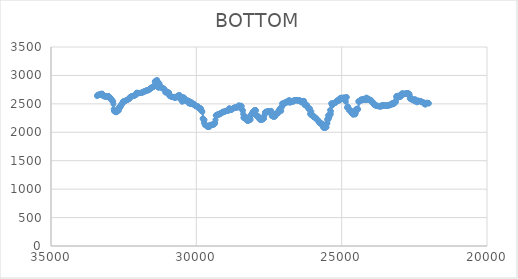
| Category | BOTTOM |
|---|---|
| 22002.2299 | 2505.87 |
| 22009.3637 | 2514.23 |
| 22019.6031 | 2514.32 |
| 22029.8431 | 2514.32 |
| 22040.0832 | 2518.51 |
| 22050.3232 | 2518.54 |
| 22060.5632 | 2512.96 |
| 22070.8032 | 2514.31 |
| 22081.0432 | 2508.74 |
| 22091.2833 | 2517.06 |
| 22101.5233 | 2518.53 |
| 22111.7633 | 2510.17 |
| 22122.0033 | 2484.98 |
| 22132.2433 | 2509.88 |
| 22142.4834 | 2507.31 |
| 22152.7234 | 2505.89 |
| 22162.9634 | 2507.27 |
| 22173.2034 | 2503.09 |
| 22183.4434 | 2523.99 |
| 22193.6835 | 2525.57 |
| 22203.9235 | 2525.58 |
| 22214.1635 | 2526.98 |
| 22224.4035 | 2531.18 |
| 22234.6435 | 2534 |
| 22244.8836 | 2532.63 |
| 22255.1236 | 2532.62 |
| 22265.3636 | 2531.22 |
| 22275.6036 | 2549.36 |
| 22285.8436 | 2549.51 |
| 22296.0837 | 2549.51 |
| 22306.3237 | 2549.51 |
| 22316.5637 | 2550.91 |
| 22326.8037 | 2550.92 |
| 22337.0437 | 2552.31 |
| 22347.2838 | 2552.32 |
| 22357.5238 | 2542.55 |
| 22367.7638 | 2553.65 |
| 22378.0038 | 2542.56 |
| 22388.2438 | 2559.23 |
| 22398.4839 | 2549.58 |
| 22408.7239 | 2525.76 |
| 22418.9639 | 2553.52 |
| 22429.2039 | 2553.73 |
| 22439.4439 | 2548.14 |
| 22449.684 | 2542.51 |
| 22459.924 | 2576 |
| 22470.164 | 2576.25 |
| 22480.404 | 2576.25 |
| 22490.6441 | 2567.87 |
| 22500.8841 | 2545.45 |
| 22511.1241 | 2573.24 |
| 22521.3641 | 2565.05 |
| 22531.6041 | 2574.78 |
| 22541.8442 | 2574.85 |
| 22552.0842 | 2567.86 |
| 22562.3242 | 2576.19 |
| 22572.5642 | 2573.46 |
| 22582.8042 | 2576.23 |
| 22593.0443 | 2576.25 |
| 22603.2843 | 2584.64 |
| 22613.5243 | 2608.46 |
| 22623.7643 | 2589.06 |
| 22634.0043 | 2590.32 |
| 22644.2444 | 2597.32 |
| 22654.4844 | 2591.78 |
| 22664.7244 | 2667.24 |
| 22674.9644 | 2664.95 |
| 22685.2044 | 2678.92 |
| 22695.4445 | 2679.01 |
| 22705.6845 | 2680.41 |
| 22715.9245 | 2684.61 |
| 22726.1645 | 2681.84 |
| 22736.4045 | 2683.22 |
| 22746.6446 | 2684.63 |
| 22756.8846 | 2684.64 |
| 22767.1246 | 2688.84 |
| 22777.3646 | 2688.86 |
| 22787.6046 | 2676.27 |
| 22797.8447 | 2674.8 |
| 22808.0847 | 2674.79 |
| 22818.3247 | 2674.79 |
| 22828.5647 | 2673.39 |
| 22838.8047 | 2677.58 |
| 22849.0448 | 2677.6 |
| 22859.2848 | 2677.6 |
| 22869.5248 | 2666.41 |
| 22879.7648 | 2677.54 |
| 22890.0049 | 2676.2 |
| 22900.2449 | 2685.99 |
| 22910.4849 | 2667.86 |
| 22920.7249 | 2678.95 |
| 22930.9649 | 2662.22 |
| 22941.205 | 2680.31 |
| 22951.445 | 2655.22 |
| 22961.685 | 2631.29 |
| 22971.925 | 2628.35 |
| 22982.165 | 2631.14 |
| 22992.4051 | 2622.75 |
| 23002.6451 | 2626.91 |
| 23012.8851 | 2624.13 |
| 23023.1251 | 2625.51 |
| 23033.3651 | 2624.12 |
| 23043.6052 | 2624.11 |
| 23053.8452 | 2643.72 |
| 23064.0852 | 2606.01 |
| 23074.3252 | 2633.82 |
| 23084.5652 | 2629.77 |
| 23094.8053 | 2633.94 |
| 23105.0453 | 2633.97 |
| 23115.2853 | 2636.77 |
| 23125.5253 | 2618.57 |
| 23135.7653 | 2535.85 |
| 23146.0054 | 2527.03 |
| 23156.2454 | 2525.59 |
| 23166.4854 | 2525.58 |
| 23176.7254 | 2511.57 |
| 23186.9654 | 2533.92 |
| 23197.2055 | 2513.01 |
| 23207.4455 | 2498.9 |
| 23217.6855 | 2494.63 |
| 23227.9255 | 2508.62 |
| 23238.1656 | 2494.68 |
| 23248.4056 | 2496.01 |
| 23258.6456 | 2511.43 |
| 23268.8856 | 2508.7 |
| 23279.1256 | 2501.68 |
| 23289.3657 | 2490.44 |
| 23299.6057 | 2483.38 |
| 23309.8457 | 2483.35 |
| 23320.0857 | 2484.75 |
| 23330.3257 | 2476.35 |
| 23340.5658 | 2481.92 |
| 23350.8058 | 2486.15 |
| 23361.0458 | 2483.36 |
| 23371.2858 | 2473.54 |
| 23381.5258 | 2470.69 |
| 23391.7659 | 2473.49 |
| 23402.0059 | 2470.69 |
| 23412.2459 | 2470.68 |
| 23422.4859 | 2470.68 |
| 23432.7259 | 2463.67 |
| 23442.966 | 2473.46 |
| 23453.206 | 2473.5 |
| 23463.446 | 2470.69 |
| 23473.686 | 2467.88 |
| 23483.926 | 2467.87 |
| 23494.1661 | 2469.27 |
| 23504.4061 | 2469.28 |
| 23514.6461 | 2469.28 |
| 23524.8861 | 2466.47 |
| 23535.1261 | 2470.67 |
| 23545.3662 | 2470.68 |
| 23555.6062 | 2470.68 |
| 23565.8462 | 2470.68 |
| 23576.0862 | 2470.68 |
| 23586.3262 | 2472.09 |
| 23596.5663 | 2480.51 |
| 23606.8063 | 2472.12 |
| 23617.0463 | 2469.28 |
| 23627.2863 | 2469.28 |
| 23637.5264 | 2452.44 |
| 23647.7664 | 2466.42 |
| 23658.0064 | 2463.65 |
| 23668.2464 | 2452.42 |
| 23678.4864 | 2463.61 |
| 23688.7265 | 2448.21 |
| 23698.9665 | 2459.39 |
| 23709.2065 | 2460.83 |
| 23719.4465 | 2463.64 |
| 23729.6865 | 2463.64 |
| 23739.9266 | 2463.64 |
| 23750.1666 | 2460.84 |
| 23760.4066 | 2463.64 |
| 23770.6466 | 2458.03 |
| 23780.8866 | 2465.03 |
| 23791.1267 | 2463.65 |
| 23801.3667 | 2472.07 |
| 23811.6067 | 2467.88 |
| 23821.8467 | 2467.87 |
| 23832.0867 | 2470.68 |
| 23842.3268 | 2487.53 |
| 23852.5668 | 2476.34 |
| 23862.8068 | 2480.53 |
| 23873.0468 | 2480.54 |
| 23883.2868 | 2481.94 |
| 23893.5269 | 2497.39 |
| 23903.7669 | 2497.43 |
| 23914.0069 | 2525.52 |
| 23924.2469 | 2525.58 |
| 23934.4869 | 2524.18 |
| 23944.727 | 2524.17 |
| 23954.967 | 2525.58 |
| 23965.207 | 2535.41 |
| 23975.447 | 2546.67 |
| 23985.6871 | 2560.74 |
| 23995.9271 | 2567.79 |
| 24006.1671 | 2562.19 |
| 24016.4071 | 2563.58 |
| 24026.6471 | 2564.99 |
| 24036.8872 | 2577.64 |
| 24047.1272 | 2569.23 |
| 24057.3672 | 2569.22 |
| 24067.6072 | 2573.43 |
| 24077.8472 | 2583.28 |
| 24088.0873 | 2583.29 |
| 24098.3273 | 2577.67 |
| 24108.5673 | 2579.07 |
| 24118.8073 | 2590.31 |
| 24129.0473 | 2602.98 |
| 24139.2874 | 2605.81 |
| 24149.5274 | 2608.63 |
| 24159.7674 | 2569.27 |
| 24170.0074 | 2566.4 |
| 24180.2474 | 2570.62 |
| 24190.4875 | 2570.62 |
| 24200.7275 | 2567.81 |
| 24210.9675 | 2574.84 |
| 24221.2075 | 2590.31 |
| 24231.4475 | 2573.46 |
| 24241.6876 | 2580.47 |
| 24251.9276 | 2576.26 |
| 24262.1676 | 2573.44 |
| 24272.4076 | 2586.1 |
| 24282.6476 | 2570.64 |
| 24292.8877 | 2576.25 |
| 24303.1277 | 2559.38 |
| 24313.3677 | 2569.21 |
| 24323.6077 | 2569.22 |
| 24333.8478 | 2579.06 |
| 24344.0878 | 2562.19 |
| 24354.3278 | 2556.55 |
| 24364.5678 | 2563.58 |
| 24374.8078 | 2553.74 |
| 24385.0479 | 2543.88 |
| 24395.2879 | 2545.29 |
| 24405.5279 | 2532.62 |
| 24415.7679 | 2543.87 |
| 24426.0079 | 2543.88 |
| 24436.248 | 2401.76 |
| 24446.488 | 2410.15 |
| 24456.728 | 2417.19 |
| 24466.968 | 2407.34 |
| 24477.208 | 2407.34 |
| 24487.4481 | 2403.12 |
| 24497.6881 | 2403.12 |
| 24507.9281 | 2348.23 |
| 24518.1681 | 2400.3 |
| 24528.4081 | 2317.25 |
| 24538.6482 | 2314.44 |
| 24548.8882 | 2324.29 |
| 24559.1282 | 2324.29 |
| 24569.3682 | 2328.51 |
| 24579.6082 | 2336.96 |
| 24589.8483 | 2328.51 |
| 24600.0883 | 2313.03 |
| 24610.3283 | 2313.03 |
| 24620.5683 | 2315.85 |
| 24630.8084 | 2334.15 |
| 24641.0484 | 2336.96 |
| 24651.2884 | 2339.78 |
| 24661.5284 | 2342.6 |
| 24671.7684 | 2370.73 |
| 24682.0085 | 2355.27 |
| 24692.2485 | 2379.19 |
| 24702.4885 | 2374.98 |
| 24712.7285 | 2393.26 |
| 24722.9685 | 2394.67 |
| 24733.2086 | 2389.04 |
| 24743.4486 | 2389.05 |
| 24753.6886 | 2396.09 |
| 24763.9286 | 2407.37 |
| 24774.1686 | 2446.74 |
| 24784.4087 | 2435.51 |
| 24794.6487 | 2455.18 |
| 24804.8887 | 2431.27 |
| 24815.1287 | 2435.68 |
| 24825.3687 | 2618.48 |
| 24835.6088 | 2612.85 |
| 24845.8488 | 2612.77 |
| 24856.0888 | 2538.33 |
| 24866.3288 | 2607.16 |
| 24876.5688 | 2556.61 |
| 24886.8089 | 2607.22 |
| 24897.0489 | 2607.22 |
| 24907.2889 | 2607.22 |
| 24917.5289 | 2607.22 |
| 24927.769 | 2607.22 |
| 24938.009 | 2607.22 |
| 24948.249 | 2605.78 |
| 24958.489 | 2583.32 |
| 24968.729 | 2604.41 |
| 24978.9691 | 2605.81 |
| 24989.2091 | 2600.18 |
| 24999.4491 | 2600.19 |
| 25009.6891 | 2605.82 |
| 25019.9291 | 2607.21 |
| 25030.1692 | 2602.95 |
| 25040.4092 | 2574.9 |
| 25050.6492 | 2602.95 |
| 25060.8892 | 2579.08 |
| 25071.1292 | 2586.1 |
| 25081.3693 | 2580.42 |
| 25091.6093 | 2552.37 |
| 25101.8493 | 2574.85 |
| 25112.0893 | 2574.81 |
| 25122.3293 | 2559.36 |
| 25132.5694 | 2559.36 |
| 25142.8094 | 2557.95 |
| 25153.0494 | 2555.13 |
| 25163.2894 | 2552.32 |
| 25173.5294 | 2552.29 |
| 25183.7695 | 2535.45 |
| 25194.0095 | 2541.03 |
| 25204.2495 | 2525.57 |
| 25214.4895 | 2522.75 |
| 25224.7296 | 2515.73 |
| 25234.9696 | 2515.72 |
| 25245.2096 | 2512.9 |
| 25255.4496 | 2510.09 |
| 25265.6896 | 2508.68 |
| 25275.9297 | 2507.28 |
| 25286.1697 | 2507.28 |
| 25296.4097 | 2508.68 |
| 25306.6497 | 2504.45 |
| 25316.8897 | 2500.16 |
| 25327.1298 | 2472.17 |
| 25337.3698 | 2501.67 |
| 25347.6098 | 2507.28 |
| 25357.8498 | 2505.47 |
| 25368.0898 | 2370.59 |
| 25378.3299 | 2318.65 |
| 25388.5699 | 2316.07 |
| 25398.8099 | 2390.26 |
| 25409.0499 | 2328.36 |
| 25419.2899 | 2280.62 |
| 25429.53 | 2270.77 |
| 25439.77 | 2260.86 |
| 25450.01 | 2234.17 |
| 25460.25 | 2224.59 |
| 25470.49 | 2295.9 |
| 25480.7301 | 2225.52 |
| 25490.9701 | 2157.02 |
| 25501.2101 | 2225.52 |
| 25511.4501 | 2156.55 |
| 25521.6902 | 2090.61 |
| 25531.9302 | 2086.4 |
| 25542.1702 | 2086.4 |
| 25552.4102 | 2086.38 |
| 25562.6502 | 2079.57 |
| 25572.8903 | 2134.06 |
| 25583.1303 | 2079.37 |
| 25593.3703 | 2079.37 |
| 25603.6103 | 2080.77 |
| 25613.8503 | 2080.79 |
| 25624.0904 | 2085 |
| 25634.3304 | 2086.48 |
| 25644.5704 | 2104.78 |
| 25654.8104 | 2122.97 |
| 25665.0504 | 2114.72 |
| 25675.2905 | 2155.34 |
| 25685.5305 | 2146.88 |
| 25695.7705 | 2134.34 |
| 25706.0105 | 2152.6 |
| 25716.2505 | 2161 |
| 25726.4906 | 2159.61 |
| 25736.7306 | 2161.06 |
| 25746.9706 | 2172.22 |
| 25757.2106 | 2161.03 |
| 25767.4506 | 2165.27 |
| 25777.6907 | 2173.79 |
| 25787.9307 | 2199.04 |
| 25798.1707 | 2204.62 |
| 25808.4107 | 2199.07 |
| 25818.6508 | 2211.68 |
| 25828.8908 | 2211.76 |
| 25839.1308 | 2228.55 |
| 25849.3708 | 2224.35 |
| 25859.6108 | 2224.39 |
| 25869.8509 | 2232.86 |
| 25880.0909 | 2246.89 |
| 25890.3309 | 2249.73 |
| 25900.5709 | 2258.15 |
| 25910.8109 | 2262.36 |
| 25921.051 | 2262.36 |
| 25931.291 | 2262.37 |
| 25941.531 | 2265.16 |
| 25951.771 | 2263.86 |
| 25962.011 | 2283.4 |
| 25972.2511 | 2268.11 |
| 25982.4911 | 2294.76 |
| 25992.7311 | 2300.35 |
| 26002.9711 | 2297.57 |
| 26013.2111 | 2303.14 |
| 26023.4512 | 2296.17 |
| 26033.6912 | 2303.49 |
| 26043.9312 | 2367.64 |
| 26054.1712 | 2310.21 |
| 26064.4113 | 2310.24 |
| 26074.6513 | 2315.92 |
| 26084.8913 | 2330.36 |
| 26095.1313 | 2418.59 |
| 26105.3713 | 2415.79 |
| 26115.6114 | 2415.73 |
| 26125.8514 | 2404.6 |
| 26136.0914 | 2420 |
| 26146.3314 | 2418.7 |
| 26156.5714 | 2438.31 |
| 26166.8115 | 2438.38 |
| 26177.0515 | 2452.35 |
| 26187.2915 | 2445.54 |
| 26197.5315 | 2483.33 |
| 26207.7715 | 2479.13 |
| 26218.0116 | 2479.11 |
| 26228.2516 | 2476.34 |
| 26238.4916 | 2481.93 |
| 26248.7316 | 2479.14 |
| 26258.9716 | 2480.52 |
| 26269.2117 | 2477.82 |
| 26279.4517 | 2496.3 |
| 26289.6917 | 2548.09 |
| 26299.9317 | 2546.72 |
| 26310.1717 | 2550.92 |
| 26320.4118 | 2552.29 |
| 26330.6518 | 2546.72 |
| 26340.8918 | 2550.92 |
| 26351.1318 | 2550.91 |
| 26361.3719 | 2549.51 |
| 26371.6119 | 2549.37 |
| 26381.8519 | 2524.31 |
| 26392.0919 | 2549.51 |
| 26402.3319 | 2549.45 |
| 26412.572 | 2538.3 |
| 26422.812 | 2548.16 |
| 26433.052 | 2559.38 |
| 26443.292 | 2562.18 |
| 26453.532 | 2562.11 |
| 26463.7721 | 2550.96 |
| 26474.0121 | 2557.96 |
| 26484.2521 | 2559.35 |
| 26494.4921 | 2557.96 |
| 26504.7321 | 2557.96 |
| 26514.9722 | 2557.96 |
| 26525.2122 | 2557.97 |
| 26535.4522 | 2560.8 |
| 26545.6922 | 2566.41 |
| 26555.9322 | 2567.82 |
| 26566.1723 | 2569.22 |
| 26576.4123 | 2569.18 |
| 26586.6523 | 2563.59 |
| 26596.8923 | 2563.59 |
| 26607.1324 | 2563.59 |
| 26617.3724 | 2563.57 |
| 26627.6124 | 2560.77 |
| 26637.8524 | 2560.68 |
| 26648.0924 | 2545.27 |
| 26658.3325 | 2542.47 |
| 26668.5725 | 2542.47 |
| 26678.8125 | 2542.55 |
| 26689.0525 | 2555.08 |
| 26699.2925 | 2545.28 |
| 26709.5326 | 2543.89 |
| 26719.7726 | 2545.18 |
| 26730.0126 | 2528.49 |
| 26740.2526 | 2543.83 |
| 26750.4926 | 2535.42 |
| 26760.7327 | 2532.68 |
| 26770.9727 | 2542.35 |
| 26781.2127 | 2522.76 |
| 26791.4527 | 2523.02 |
| 26801.6927 | 2563.58 |
| 26811.9328 | 2562.16 |
| 26822.1728 | 2559.29 |
| 26832.4128 | 2548.09 |
| 26842.6528 | 2546.69 |
| 26852.8929 | 2545.27 |
| 26863.1329 | 2542.43 |
| 26873.3729 | 2535.37 |
| 26883.6129 | 2525.66 |
| 26893.8529 | 2538.15 |
| 26904.093 | 2522.76 |
| 26914.333 | 2522.76 |
| 26924.573 | 2522.76 |
| 26934.813 | 2522.76 |
| 26945.053 | 2522.78 |
| 26955.2931 | 2525.44 |
| 26965.5331 | 2504.45 |
| 26975.7731 | 2501.67 |
| 26986.0131 | 2504.45 |
| 26996.2531 | 2501.65 |
| 27006.4932 | 2501.65 |
| 27016.7332 | 2501.66 |
| 27026.9732 | 2503.07 |
| 27037.2132 | 2504.48 |
| 27047.4532 | 2505.45 |
| 27057.6933 | 2442.53 |
| 27067.9333 | 2442.08 |
| 27078.1733 | 2375.35 |
| 27088.4133 | 2432.66 |
| 27098.6534 | 2429.83 |
| 27108.8934 | 2425.52 |
| 27119.1334 | 2407.26 |
| 27129.3734 | 2396.18 |
| 27139.6134 | 2409.97 |
| 27149.8535 | 2383.41 |
| 27160.0935 | 2383.39 |
| 27170.3335 | 2380.37 |
| 27180.5735 | 2348.13 |
| 27190.8135 | 2335.52 |
| 27201.0536 | 2331.36 |
| 27211.2936 | 2335.5 |
| 27221.5336 | 2328.51 |
| 27231.7736 | 2328.48 |
| 27242.0136 | 2324.32 |
| 27252.2537 | 2328.51 |
| 27262.4937 | 2328.52 |
| 27272.7337 | 2329.58 |
| 27282.9737 | 2282.06 |
| 27293.2137 | 2282.05 |
| 27303.4538 | 2280.62 |
| 27313.6938 | 2276.43 |
| 27323.9338 | 2276.45 |
| 27334.1738 | 2279.24 |
| 27344.4139 | 2277.81 |
| 27354.6539 | 2273.67 |
| 27364.8939 | 2280.71 |
| 27375.1339 | 2287.66 |
| 27385.3739 | 2283.59 |
| 27395.614 | 2300.26 |
| 27405.854 | 2286.51 |
| 27416.094 | 2317.69 |
| 27426.334 | 2376.36 |
| 27436.574 | 2374.93 |
| 27446.8141 | 2370.76 |
| 27457.0541 | 2373.53 |
| 27467.2941 | 2369.36 |
| 27477.5341 | 2372.13 |
| 27487.7741 | 2369.33 |
| 27498.0142 | 2369.33 |
| 27508.2542 | 2369.33 |
| 27518.4942 | 2369.33 |
| 27528.7342 | 2369.3 |
| 27538.9742 | 2365.11 |
| 27549.2143 | 2365.11 |
| 27559.4543 | 2365.05 |
| 27569.6943 | 2356.69 |
| 27579.9343 | 2359.53 |
| 27590.1744 | 2366.41 |
| 27600.4144 | 2352.44 |
| 27610.6544 | 2352.42 |
| 27620.8944 | 2349.63 |
| 27631.1344 | 2349.63 |
| 27641.3745 | 2349.29 |
| 27651.6145 | 2305.86 |
| 27661.8545 | 2288.73 |
| 27672.0945 | 2241.21 |
| 27682.3345 | 2237.01 |
| 27692.5746 | 2235.61 |
| 27702.8146 | 2235.55 |
| 27713.0546 | 2227.15 |
| 27723.2946 | 2225.75 |
| 27733.5346 | 2224.34 |
| 27743.7747 | 2222.93 |
| 27754.0147 | 2221.55 |
| 27764.2547 | 2222.94 |
| 27774.4947 | 2222.93 |
| 27784.7347 | 2221.55 |
| 27794.9748 | 2222.97 |
| 27805.2148 | 2225.76 |
| 27815.4548 | 2225.77 |
| 27825.6948 | 2227.45 |
| 27835.9349 | 2262.36 |
| 27846.1749 | 2262.36 |
| 27856.4149 | 2262.36 |
| 27866.6549 | 2262.54 |
| 27876.8949 | 2284.87 |
| 27887.135 | 2283.39 |
| 27897.375 | 2273.63 |
| 27907.615 | 2275.1 |
| 27917.855 | 2284.88 |
| 27928.095 | 2285.02 |
| 27938.3351 | 2302.41 |
| 27948.5751 | 2379.29 |
| 27958.8151 | 2391.86 |
| 27969.0551 | 2391.84 |
| 27979.2951 | 2390.43 |
| 27989.5352 | 2387.65 |
| 27999.7752 | 2388.87 |
| 28010.0152 | 2367.93 |
| 28020.2552 | 2367.84 |
| 28030.4953 | 2358.12 |
| 28040.7353 | 2363.69 |
| 28050.9753 | 2362.3 |
| 28061.2153 | 2361.93 |
| 28071.4553 | 2318.77 |
| 28081.6954 | 2331.33 |
| 28091.9354 | 2331.21 |
| 28102.1754 | 2317.11 |
| 28112.4154 | 2300.28 |
| 28122.6554 | 2289.95 |
| 28132.8955 | 2225.7 |
| 28143.1355 | 2219.32 |
| 28153.3755 | 2288.49 |
| 28163.6155 | 2218.72 |
| 28173.8555 | 2218.67 |
| 28184.0956 | 2213.05 |
| 28194.3356 | 2208.89 |
| 28204.5756 | 2211.6 |
| 28214.8156 | 2201.85 |
| 28225.0556 | 2204.67 |
| 28235.2957 | 2207.43 |
| 28245.5357 | 2204.66 |
| 28255.7757 | 2206.09 |
| 28266.0157 | 2210.66 |
| 28276.2558 | 2253.91 |
| 28286.4958 | 2253.93 |
| 28296.7358 | 2256.46 |
| 28306.9758 | 2227.49 |
| 28317.2158 | 2263.73 |
| 28327.4559 | 2259.75 |
| 28337.6959 | 2283.48 |
| 28347.9359 | 2284.74 |
| 28358.1759 | 2269.27 |
| 28368.4159 | 2255.32 |
| 28378.656 | 2255.9 |
| 28388.896 | 2320.59 |
| 28399.136 | 2377.91 |
| 28409.376 | 2391.87 |
| 28419.616 | 2393.29 |
| 28429.8561 | 2396.64 |
| 28440.0961 | 2458 |
| 28450.3361 | 2456.58 |
| 28460.5761 | 2453.93 |
| 28470.8161 | 2469.21 |
| 28481.0562 | 2462.22 |
| 28491.2962 | 2460.83 |
| 28501.5362 | 2460.83 |
| 28511.7762 | 2460.83 |
| 28522.0163 | 2460.91 |
| 28532.2563 | 2469.28 |
| 28542.4963 | 2469.28 |
| 28552.7363 | 2469.05 |
| 28562.9763 | 2445.29 |
| 28573.2164 | 2439.69 |
| 28583.4564 | 2436.93 |
| 28593.6964 | 2439.69 |
| 28603.9364 | 2436.89 |
| 28614.1764 | 2435.51 |
| 28624.4165 | 2436.9 |
| 28634.6565 | 2436.9 |
| 28644.8965 | 2436.86 |
| 28655.1365 | 2432.73 |
| 28665.3765 | 2438.24 |
| 28675.6166 | 2431.27 |
| 28685.8566 | 2431.32 |
| 28696.0966 | 2436.81 |
| 28706.3366 | 2427.01 |
| 28716.5767 | 2422.82 |
| 28726.8167 | 2422.74 |
| 28737.0567 | 2414.36 |
| 28747.2967 | 2412.97 |
| 28757.5367 | 2412.86 |
| 28767.7768 | 2401.72 |
| 28778.0168 | 2403.08 |
| 28788.2568 | 2398.88 |
| 28798.4968 | 2397.5 |
| 28808.7368 | 2398.94 |
| 28818.9769 | 2403.02 |
| 28829.2169 | 2393.26 |
| 28839.4569 | 2393.28 |
| 28849.6969 | 2394.96 |
| 28859.9369 | 2423.83 |
| 28870.177 | 2383.72 |
| 28880.417 | 2414.11 |
| 28890.657 | 2387.61 |
| 28900.897 | 2384.82 |
| 28911.1371 | 2384.82 |
| 28921.3771 | 2384.79 |
| 28931.6171 | 2381.93 |
| 28941.8571 | 2374.99 |
| 28952.0971 | 2377.78 |
| 28962.3372 | 2377.75 |
| 28972.5772 | 2374.97 |
| 28982.8172 | 2374.98 |
| 28993.0572 | 2376.32 |
| 29003.2972 | 2370.67 |
| 29013.5373 | 2363.69 |
| 29023.7773 | 2362.28 |
| 29034.0173 | 2360.87 |
| 29044.2573 | 2359.5 |
| 29054.4973 | 2360.87 |
| 29064.7374 | 2359.5 |
| 29074.9774 | 2360.87 |
| 29085.2174 | 2359.51 |
| 29095.4574 | 2362.11 |
| 29105.6974 | 2344 |
| 29115.9375 | 2344 |
| 29126.1775 | 2343.9 |
| 29136.4175 | 2334.13 |
| 29146.6575 | 2332.77 |
| 29156.8976 | 2335.49 |
| 29167.1376 | 2329.88 |
| 29177.3776 | 2325.79 |
| 29187.6176 | 2333.95 |
| 29197.8576 | 2315.85 |
| 29208.0977 | 2315.85 |
| 29218.3377 | 2315.82 |
| 29228.5777 | 2313.03 |
| 29238.8177 | 2313.03 |
| 29249.0577 | 2313.04 |
| 29259.2978 | 2314.45 |
| 29269.5378 | 2315.71 |
| 29279.7778 | 2303.19 |
| 29290.0178 | 2304.58 |
| 29300.2578 | 2304.57 |
| 29310.4979 | 2303.15 |
| 29320.7379 | 2300.32 |
| 29330.9779 | 2295.34 |
| 29341.2179 | 2220.92 |
| 29351.458 | 2163.81 |
| 29361.698 | 2162.29 |
| 29371.938 | 2151.12 |
| 29382.178 | 2148.22 |
| 29392.418 | 2137.06 |
| 29402.6581 | 2135.84 |
| 29412.8981 | 2150.99 |
| 29423.1381 | 2135.73 |
| 29433.3781 | 2141.19 |
| 29443.6181 | 2131.4 |
| 29453.8582 | 2127.22 |
| 29464.0982 | 2127.22 |
| 29474.3382 | 2127.22 |
| 29484.5782 | 2127.26 |
| 29494.8182 | 2130.04 |
| 29505.0583 | 2130.04 |
| 29515.2983 | 2130.04 |
| 29525.5383 | 2129.95 |
| 29535.7783 | 2121.36 |
| 29546.0184 | 2100.67 |
| 29556.2584 | 2117.09 |
| 29566.4984 | 2092.05 |
| 29576.7384 | 2093.49 |
| 29586.9784 | 2097.62 |
| 29597.2185 | 2093.52 |
| 29607.4585 | 2100.45 |
| 29617.6985 | 2097.87 |
| 29627.9385 | 2115.96 |
| 29638.1785 | 2115.9 |
| 29648.4186 | 2110.41 |
| 29658.6586 | 2117.37 |
| 29668.8986 | 2117.45 |
| 29679.1386 | 2124.43 |
| 29689.3786 | 2125.82 |
| 29699.6187 | 2126.01 |
| 29709.8587 | 2143.54 |
| 29720.0987 | 2216.02 |
| 29730.3387 | 2225.09 |
| 29740.5788 | 2167.34 |
| 29750.8188 | 2228.57 |
| 29761.0588 | 2228.72 |
| 29771.2988 | 2241.23 |
| 29781.5388 | 2241.21 |
| 29791.7789 | 2359.64 |
| 29802.0189 | 2373.56 |
| 29812.2589 | 2373.57 |
| 29822.4989 | 2375.08 |
| 29832.7389 | 2385.21 |
| 29842.979 | 2418.6 |
| 29853.219 | 2418.62 |
| 29863.459 | 2419.89 |
| 29873.699 | 2410.36 |
| 29883.939 | 2427.05 |
| 29894.1791 | 2426.91 |
| 29904.4191 | 2415.95 |
| 29914.6591 | 2430.03 |
| 29924.8991 | 2443.97 |
| 29935.1392 | 2446.86 |
| 29945.3792 | 2455.11 |
| 29955.6192 | 2448.32 |
| 29965.8592 | 2460.85 |
| 29976.0992 | 2462.22 |
| 29986.3393 | 2460.83 |
| 29996.5793 | 2460.79 |
| 30006.8193 | 2458.01 |
| 30017.0593 | 2458.01 |
| 30027.2993 | 2458.14 |
| 30037.5394 | 2467.89 |
| 30047.7794 | 2469.45 |
| 30058.0194 | 2483.53 |
| 30068.2594 | 2497.27 |
| 30078.4994 | 2484.74 |
| 30088.7395 | 2483.57 |
| 30098.9795 | 2500.31 |
| 30109.2195 | 2505.87 |
| 30119.4595 | 2505.87 |
| 30129.6996 | 2505.89 |
| 30139.9396 | 2507.3 |
| 30150.1796 | 2508.71 |
| 30160.4196 | 2510.11 |
| 30170.6596 | 2511.8 |
| 30180.8997 | 2533.55 |
| 30191.1397 | 2497.43 |
| 30201.3797 | 2497.96 |
| 30211.6197 | 2538.23 |
| 30221.8597 | 2536.9 |
| 30232.0998 | 2541.03 |
| 30242.3398 | 2538.38 |
| 30252.5798 | 2547.56 |
| 30262.8198 | 2507.81 |
| 30273.0598 | 2546.86 |
| 30283.2999 | 2559.23 |
| 30293.5399 | 2549.53 |
| 30303.7799 | 2550.86 |
| 30314.0199 | 2546.69 |
| 30324.26 | 2546.71 |
| 30334.5 | 2548.08 |
| 30344.74 | 2547.06 |
| 30354.98 | 2573.48 |
| 30365.22 | 2576.33 |
| 30375.4601 | 2581.88 |
| 30385.7001 | 2581.94 |
| 30395.9401 | 2586.15 |
| 30406.1801 | 2589.2 |
| 30416.4201 | 2608.57 |
| 30426.6602 | 2603.64 |
| 30436.9002 | 2550.36 |
| 30447.1402 | 2610.14 |
| 30457.3802 | 2616.84 |
| 30467.6202 | 2599.51 |
| 30477.8603 | 2552.08 |
| 30488.1003 | 2536.26 |
| 30498.3403 | 2593.15 |
| 30508.5803 | 2593.13 |
| 30518.8204 | 2591.68 |
| 30529.0604 | 2587.49 |
| 30539.3004 | 2586.09 |
| 30549.5404 | 2584.7 |
| 30559.7804 | 2585.68 |
| 30570.0205 | 2652.24 |
| 30580.2605 | 2650.86 |
| 30590.5005 | 2650.8 |
| 30600.7405 | 2646.63 |
| 30610.9805 | 2646.59 |
| 30621.2206 | 2643.82 |
| 30631.4606 | 2643.74 |
| 30641.7006 | 2638.19 |
| 30651.9406 | 2637.94 |
| 30662.1806 | 2621.28 |
| 30672.4207 | 2619.85 |
| 30682.6607 | 2617.1 |
| 30692.9007 | 2618.48 |
| 30703.1407 | 2618.48 |
| 30713.3808 | 2618.48 |
| 30723.6208 | 2618.21 |
| 30733.8608 | 2600.55 |
| 30744.1008 | 2624.07 |
| 30754.3408 | 2621.3 |
| 30764.5809 | 2621.25 |
| 30774.8209 | 2618.48 |
| 30785.0609 | 2618.48 |
| 30795.3009 | 2618.53 |
| 30805.5409 | 2621.25 |
| 30815.781 | 2618.48 |
| 30826.021 | 2618.53 |
| 30836.261 | 2621.34 |
| 30846.501 | 2624.16 |
| 30856.741 | 2626.91 |
| 30866.9811 | 2625.74 |
| 30877.2211 | 2639.6 |
| 30887.4611 | 2639.62 |
| 30897.7011 | 2640.98 |
| 30907.9412 | 2639.64 |
| 30918.1812 | 2642.46 |
| 30928.4212 | 2646.08 |
| 30938.6612 | 2698.69 |
| 30948.9012 | 2697.31 |
| 30959.1413 | 2697.33 |
| 30969.3813 | 2698.74 |
| 30979.6213 | 2700.17 |
| 30989.8613 | 2702.99 |
| 31000.1013 | 2705.75 |
| 31010.3414 | 2705.59 |
| 31020.5814 | 2696.18 |
| 31030.8214 | 2713 |
| 31041.0614 | 2725.05 |
| 31051.3014 | 2700.68 |
| 31061.5415 | 2733.37 |
| 31071.7815 | 2702.18 |
| 31082.0215 | 2740.9 |
| 31092.2615 | 2738.41 |
| 31102.5016 | 2755.28 |
| 31112.7416 | 2770.29 |
| 31122.9816 | 2758.02 |
| 31133.2216 | 2769.1 |
| 31143.4616 | 2769.12 |
| 31153.7017 | 2770.53 |
| 31163.9417 | 2772.15 |
| 31174.1817 | 2785.99 |
| 31184.4217 | 2785.92 |
| 31194.6617 | 2781.79 |
| 31204.9018 | 2783.41 |
| 31215.1418 | 2797.25 |
| 31225.3818 | 2797.18 |
| 31235.6218 | 2793.1 |
| 31245.8619 | 2797.27 |
| 31256.1019 | 2799.7 |
| 31266.3419 | 2857.99 |
| 31276.5819 | 2790.21 |
| 31286.8219 | 2791.43 |
| 31297.062 | 2859.25 |
| 31307.302 | 2783.37 |
| 31317.542 | 2795.69 |
| 31327.782 | 2866.89 |
| 31338.022 | 2904.48 |
| 31348.2621 | 2918.3 |
| 31358.5021 | 2917.68 |
| 31368.7421 | 2883.11 |
| 31378.9821 | 2883.46 |
| 31389.2221 | 2902.8 |
| 31399.4622 | 2901.41 |
| 31409.7022 | 2901.39 |
| 31419.9422 | 2899.73 |
| 31430.1822 | 2883.24 |
| 31440.4223 | 2812.68 |
| 31450.6623 | 2809.87 |
| 31460.9023 | 2807.05 |
| 31471.1423 | 2804.24 |
| 31481.3823 | 2801.35 |
| 31491.6224 | 2794.38 |
| 31501.8624 | 2791.59 |
| 31512.1024 | 2790.16 |
| 31522.3424 | 2787.37 |
| 31532.5824 | 2785.96 |
| 31542.8225 | 2784.56 |
| 31553.0625 | 2783.17 |
| 31563.3025 | 2782.94 |
| 31573.5425 | 2770.45 |
| 31583.7825 | 2767.59 |
| 31594.0226 | 2762.01 |
| 31604.2626 | 2759.11 |
| 31614.5026 | 2752.13 |
| 31624.7426 | 2747.93 |
| 31634.9827 | 2745.12 |
| 31645.2227 | 2742.33 |
| 31655.4627 | 2740.92 |
| 31665.7027 | 2739.51 |
| 31675.9427 | 2738.1 |
| 31686.1828 | 2736.67 |
| 31696.4228 | 2733.88 |
| 31706.6628 | 2732.58 |
| 31716.9028 | 2736.62 |
| 31727.1428 | 2731.09 |
| 31737.3829 | 2731.04 |
| 31747.6229 | 2728.2 |
| 31757.8629 | 2724 |
| 31768.1029 | 2721.24 |
| 31778.343 | 2721.18 |
| 31788.583 | 2718.26 |
| 31798.823 | 2710.09 |
| 31809.063 | 2715.53 |
| 31819.303 | 2711.41 |
| 31829.5431 | 2712.6 |
| 31839.7831 | 2702.91 |
| 31850.0231 | 2701.5 |
| 31860.2631 | 2700.1 |
| 31870.5031 | 2698.69 |
| 31880.7432 | 2697.25 |
| 31890.9832 | 2694.49 |
| 31901.2232 | 2694.44 |
| 31911.4632 | 2691.65 |
| 31921.7032 | 2690.27 |
| 31931.9433 | 2690.24 |
| 31942.1833 | 2688.92 |
| 31952.4233 | 2691.62 |
| 31962.6633 | 2688.86 |
| 31972.9034 | 2688.89 |
| 31983.1434 | 2690.3 |
| 31993.3834 | 2691.65 |
| 32003.6234 | 2690.27 |
| 32013.8634 | 2690.36 |
| 32024.1035 | 2694.44 |
| 32034.3435 | 2691.68 |
| 32044.5835 | 2691.79 |
| 32054.8235 | 2697.02 |
| 32065.0635 | 2682.69 |
| 32075.3036 | 2656.46 |
| 32085.5436 | 2655.02 |
| 32095.7836 | 2652.24 |
| 32106.0236 | 2650.83 |
| 32116.2637 | 2649.42 |
| 32126.5037 | 2648.04 |
| 32136.7437 | 2647.93 |
| 32146.9837 | 2642.38 |
| 32157.2237 | 2640.98 |
| 32167.4638 | 2639.6 |
| 32177.7038 | 2639.6 |
| 32187.9438 | 2639.54 |
| 32198.1838 | 2636.81 |
| 32208.4238 | 2638.13 |
| 32218.6639 | 2635.32 |
| 32228.9039 | 2632.38 |
| 32239.1439 | 2624.08 |
| 32249.3839 | 2622.65 |
| 32259.6239 | 2619.89 |
| 32269.864 | 2619.8 |
| 32280.104 | 2615.67 |
| 32290.344 | 2615.22 |
| 32300.584 | 2594.31 |
| 32310.8241 | 2583.29 |
| 32321.0641 | 2583.29 |
| 32331.3041 | 2583.26 |
| 32341.5441 | 2581.85 |
| 32351.7841 | 2580.36 |
| 32362.0242 | 2574.73 |
| 32372.2642 | 2569.16 |
| 32382.5042 | 2566.4 |
| 32392.7442 | 2566.34 |
| 32402.9842 | 2563.56 |
| 32413.2243 | 2562.18 |
| 32423.4643 | 2561.96 |
| 32433.7043 | 2552.23 |
| 32443.9443 | 2548.04 |
| 32454.1844 | 2545.23 |
| 32464.4244 | 2542.47 |
| 32474.6644 | 2542.47 |
| 32484.9044 | 2542.44 |
| 32495.1444 | 2541.06 |
| 32505.3845 | 2541.06 |
| 32515.6245 | 2541.06 |
| 32525.8645 | 2540.69 |
| 32536.1045 | 2523.86 |
| 32546.3445 | 2509.72 |
| 32556.5846 | 2493.14 |
| 32566.8246 | 2490.33 |
| 32577.0646 | 2487.35 |
| 32587.3046 | 2477.82 |
| 32597.5446 | 2481.19 |
| 32607.7847 | 2447.88 |
| 32618.0247 | 2435.78 |
| 32628.2647 | 2448.16 |
| 32638.5047 | 2448.1 |
| 32648.7448 | 2445.28 |
| 32658.9848 | 2441.22 |
| 32669.2248 | 2384.79 |
| 32679.4648 | 2383.41 |
| 32689.7048 | 2383.31 |
| 32699.9449 | 2379.16 |
| 32710.1849 | 2377.78 |
| 32720.4249 | 2377.49 |
| 32730.6649 | 2364.85 |
| 32740.9049 | 2353.85 |
| 32751.145 | 2353.98 |
| 32761.385 | 2359.61 |
| 32771.625 | 2364.98 |
| 32781.865 | 2359.51 |
| 32792.1051 | 2361.05 |
| 32802.3451 | 2367.89 |
| 32812.5851 | 2366.62 |
| 32822.8251 | 2370.94 |
| 32833.0651 | 2379.78 |
| 32843.3052 | 2406.73 |
| 32853.5452 | 2499.76 |
| 32863.7852 | 2538.58 |
| 32874.0252 | 2552.16 |
| 32884.2652 | 2545.68 |
| 32894.5053 | 2562.28 |
| 32904.7453 | 2566.6 |
| 32914.9853 | 2574.81 |
| 32925.2253 | 2573.47 |
| 32935.4654 | 2575.45 |
| 32945.7054 | 2600.15 |
| 32955.9454 | 2599.11 |
| 32966.1854 | 2612.62 |
| 32976.4254 | 2603.13 |
| 32986.6655 | 2608.66 |
| 32996.9055 | 2610.04 |
| 33007.1455 | 2610.68 |
| 33017.3855 | 2636.82 |
| 33027.6255 | 2638.19 |
| 33037.8656 | 2637.99 |
| 33048.1056 | 2629.88 |
| 33058.3456 | 2635 |
| 33068.5856 | 2620.23 |
| 33078.8256 | 2633.8 |
| 33089.0657 | 2626.83 |
| 33099.3057 | 2622.88 |
| 33109.5457 | 2629.78 |
| 33119.7857 | 2631.25 |
| 33130.0258 | 2635.2 |
| 33140.2658 | 2628.34 |
| 33150.5058 | 2628.37 |
| 33160.7458 | 2629.99 |
| 33170.9858 | 2639.56 |
| 33181.2259 | 2638.29 |
| 33191.4659 | 2642.59 |
| 33201.7059 | 2649.31 |
| 33211.9459 | 2643.85 |
| 33222.1859 | 2646.07 |
| 33232.426 | 2678.94 |
| 33242.666 | 2675.77 |
| 33252.906 | 2659.51 |
| 33263.146 | 2668.03 |
| 33273.3861 | 2678.45 |
| 33283.6261 | 2656.74 |
| 33293.8661 | 2666.34 |
| 33304.1061 | 2666.06 |
| 33314.3461 | 2655.08 |
| 33324.5862 | 2655.12 |
| 33334.8262 | 2656.74 |
| 33345.0662 | 2666.31 |
| 33355.3062 | 2664.72 |
| 33365.5462 | 2656.49 |
| 33375.7863 | 2656.42 |
| 33386.0263 | 2653.74 |
| 33396.2663 | 2656.13 |
| 33406.5063 | 2642.3 |
| 33416.7464 | 2638.12 |